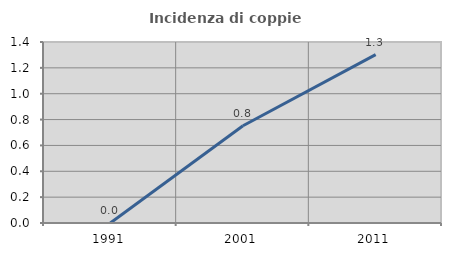
| Category | Incidenza di coppie miste |
|---|---|
| 1991.0 | 0 |
| 2001.0 | 0.752 |
| 2011.0 | 1.302 |